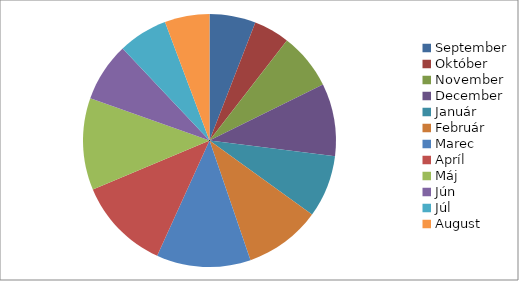
| Category | Series 0 |
|---|---|
| September | 176.4 |
| Október | 136.8 |
| November | 216 |
| December | 277.2 |
| Január | 238.5 |
| Február | 292.5 |
| Marec | 360 |
| Apríl | 355.5 |
| Máj | 351 |
| Jún | 225 |
| Júl | 189 |
| August | 171 |